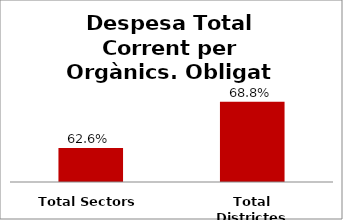
| Category | Series 0 |
|---|---|
| Total Sectors | 0.626 |
| Total Districtes | 0.688 |